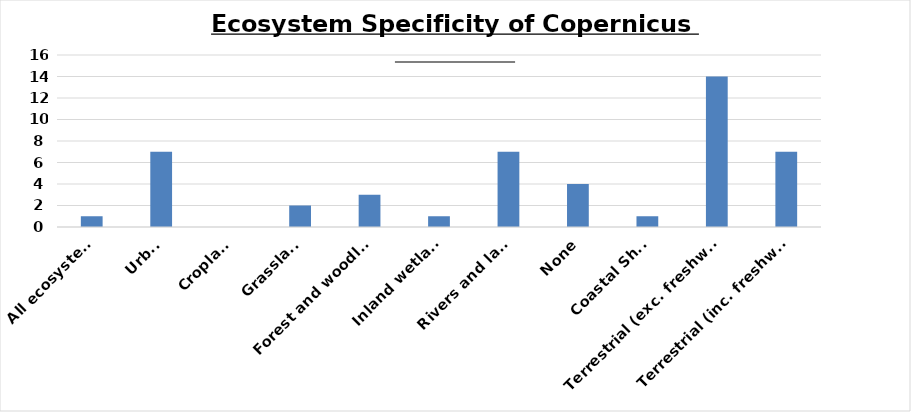
| Category | Series 0 |
|---|---|
| All ecosystems | 1 |
| Urban | 7 |
| Cropland | 0 |
| Grassland | 2 |
| Forest and woodland | 3 |
| Inland wetlands | 1 |
| Rivers and lakes | 7 |
| None | 4 |
| Coastal Shelf | 1 |
| Terrestrial (exc. freshwater) | 14 |
| Terrestrial (inc. freshwater) | 7 |